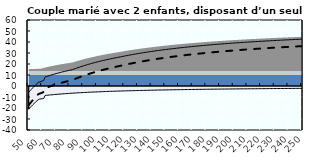
| Category | Coin fiscal moyen (somme des composantes) | Taux moyen d'imposition net en % du salaire brut |
|---|---|---|
| 50.0 | -5.731 | -17.415 |
| 51.0 | -4.304 | -15.83 |
| 52.0 | -2.932 | -14.306 |
| 53.0 | -1.612 | -12.84 |
| 54.0 | -0.341 | -11.428 |
| 55.0 | 0.884 | -10.068 |
| 56.0 | 2.066 | -8.756 |
| 57.0 | 3.206 | -7.49 |
| 58.0 | 3.729 | -6.909 |
| 59.0 | 4.074 | -6.525 |
| 60.0 | 4.6 | -5.942 |
| 61.0 | 5.108 | -5.377 |
| 62.0 | 8.122 | -2.03 |
| 63.0 | 8.559 | -1.546 |
| 64.0 | 8.981 | -1.076 |
| 65.0 | 9.391 | -0.621 |
| 66.0 | 9.788 | -0.18 |
| 67.0 | 10.174 | 0.248 |
| 68.0 | 10.548 | 0.664 |
| 69.0 | 10.911 | 1.067 |
| 70.0 | 11.264 | 1.459 |
| 71.0 | 11.607 | 1.84 |
| 72.0 | 11.941 | 2.21 |
| 73.0 | 12.265 | 2.57 |
| 74.0 | 12.58 | 2.921 |
| 75.0 | 12.888 | 3.262 |
| 76.0 | 13.187 | 3.594 |
| 77.0 | 13.478 | 3.917 |
| 78.0 | 13.762 | 4.232 |
| 79.0 | 14.038 | 4.54 |
| 80.0 | 14.308 | 4.839 |
| 81.0 | 14.571 | 5.131 |
| 82.0 | 14.871 | 5.464 |
| 83.0 | 15.338 | 5.982 |
| 84.0 | 15.793 | 6.489 |
| 85.0 | 16.239 | 6.983 |
| 86.0 | 16.673 | 7.466 |
| 87.0 | 17.098 | 7.937 |
| 88.0 | 17.513 | 8.398 |
| 89.0 | 17.919 | 8.849 |
| 90.0 | 18.316 | 9.289 |
| 91.0 | 18.704 | 9.72 |
| 92.0 | 19.083 | 10.142 |
| 93.0 | 19.455 | 10.554 |
| 94.0 | 19.818 | 10.958 |
| 95.0 | 20.174 | 11.353 |
| 96.0 | 20.522 | 11.74 |
| 97.0 | 20.864 | 12.119 |
| 98.0 | 21.198 | 12.49 |
| 99.0 | 21.525 | 12.854 |
| 100.0 | 21.846 | 13.21 |
| 101.0 | 22.161 | 13.56 |
| 102.0 | 22.47 | 13.902 |
| 103.0 | 22.772 | 14.238 |
| 104.0 | 23.069 | 14.568 |
| 105.0 | 23.36 | 14.891 |
| 106.0 | 23.645 | 15.208 |
| 107.0 | 23.925 | 15.519 |
| 108.0 | 24.2 | 15.824 |
| 109.0 | 24.47 | 16.124 |
| 110.0 | 24.735 | 16.419 |
| 111.0 | 24.996 | 16.708 |
| 112.0 | 25.251 | 16.991 |
| 113.0 | 25.502 | 17.27 |
| 114.0 | 25.749 | 17.544 |
| 115.0 | 25.991 | 17.813 |
| 116.0 | 26.23 | 18.078 |
| 117.0 | 26.465 | 18.34 |
| 118.0 | 26.722 | 18.625 |
| 119.0 | 26.975 | 18.906 |
| 120.0 | 27.223 | 19.181 |
| 121.0 | 27.467 | 19.453 |
| 122.0 | 27.708 | 19.719 |
| 123.0 | 27.944 | 19.982 |
| 124.0 | 28.177 | 20.24 |
| 125.0 | 28.405 | 20.494 |
| 126.0 | 28.631 | 20.744 |
| 127.0 | 28.852 | 20.99 |
| 128.0 | 29.07 | 21.233 |
| 129.0 | 29.285 | 21.471 |
| 130.0 | 29.497 | 21.706 |
| 131.0 | 29.705 | 21.937 |
| 132.0 | 29.91 | 22.165 |
| 133.0 | 30.112 | 22.389 |
| 134.0 | 30.311 | 22.61 |
| 135.0 | 30.507 | 22.828 |
| 136.0 | 30.7 | 23.042 |
| 137.0 | 30.89 | 23.254 |
| 138.0 | 31.078 | 23.462 |
| 139.0 | 31.263 | 23.667 |
| 140.0 | 31.445 | 23.87 |
| 141.0 | 31.625 | 24.069 |
| 142.0 | 31.802 | 24.266 |
| 143.0 | 31.977 | 24.46 |
| 144.0 | 32.149 | 24.651 |
| 145.0 | 32.319 | 24.84 |
| 146.0 | 32.486 | 25.026 |
| 147.0 | 32.651 | 25.209 |
| 148.0 | 32.814 | 25.39 |
| 149.0 | 32.975 | 25.569 |
| 150.0 | 33.134 | 25.745 |
| 151.0 | 33.29 | 25.919 |
| 152.0 | 33.445 | 26.091 |
| 153.0 | 33.597 | 26.26 |
| 154.0 | 33.748 | 26.427 |
| 155.0 | 33.896 | 26.592 |
| 156.0 | 34.043 | 26.755 |
| 157.0 | 34.188 | 26.916 |
| 158.0 | 34.331 | 27.074 |
| 159.0 | 34.472 | 27.231 |
| 160.0 | 34.611 | 27.386 |
| 161.0 | 34.749 | 27.539 |
| 162.0 | 34.885 | 27.69 |
| 163.0 | 35.019 | 27.839 |
| 164.0 | 35.152 | 27.986 |
| 165.0 | 35.283 | 28.132 |
| 166.0 | 35.413 | 28.276 |
| 167.0 | 35.541 | 28.418 |
| 168.0 | 35.667 | 28.558 |
| 169.0 | 35.792 | 28.697 |
| 170.0 | 35.915 | 28.834 |
| 171.0 | 36.037 | 28.969 |
| 172.0 | 36.158 | 29.103 |
| 173.0 | 36.277 | 29.236 |
| 174.0 | 36.395 | 29.366 |
| 175.0 | 36.511 | 29.496 |
| 176.0 | 36.626 | 29.624 |
| 177.0 | 36.74 | 29.75 |
| 178.0 | 36.853 | 29.875 |
| 179.0 | 36.964 | 29.999 |
| 180.0 | 37.074 | 30.121 |
| 181.0 | 37.183 | 30.242 |
| 182.0 | 37.291 | 30.361 |
| 183.0 | 37.397 | 30.48 |
| 184.0 | 37.503 | 30.597 |
| 185.0 | 37.607 | 30.712 |
| 186.0 | 37.71 | 30.827 |
| 187.0 | 37.812 | 30.94 |
| 188.0 | 37.913 | 31.052 |
| 189.0 | 38.012 | 31.163 |
| 190.0 | 38.111 | 31.272 |
| 191.0 | 38.209 | 31.381 |
| 192.0 | 38.306 | 31.488 |
| 193.0 | 38.401 | 31.595 |
| 194.0 | 38.496 | 31.7 |
| 195.0 | 38.59 | 31.804 |
| 196.0 | 38.683 | 31.907 |
| 197.0 | 38.774 | 32.009 |
| 198.0 | 38.865 | 32.11 |
| 199.0 | 38.955 | 32.21 |
| 200.0 | 39.044 | 32.309 |
| 201.0 | 39.133 | 32.407 |
| 202.0 | 39.22 | 32.504 |
| 203.0 | 39.306 | 32.6 |
| 204.0 | 39.392 | 32.695 |
| 205.0 | 39.477 | 32.789 |
| 206.0 | 39.561 | 32.882 |
| 207.0 | 39.644 | 32.975 |
| 208.0 | 39.726 | 33.066 |
| 209.0 | 39.808 | 33.157 |
| 210.0 | 39.889 | 33.247 |
| 211.0 | 39.969 | 33.335 |
| 212.0 | 40.048 | 33.423 |
| 213.0 | 40.127 | 33.511 |
| 214.0 | 40.204 | 33.597 |
| 215.0 | 40.282 | 33.683 |
| 216.0 | 40.358 | 33.767 |
| 217.0 | 40.434 | 33.851 |
| 218.0 | 40.509 | 33.935 |
| 219.0 | 40.583 | 34.017 |
| 220.0 | 40.656 | 34.099 |
| 221.0 | 40.729 | 34.18 |
| 222.0 | 40.802 | 34.26 |
| 223.0 | 40.873 | 34.34 |
| 224.0 | 40.944 | 34.419 |
| 225.0 | 41.015 | 34.497 |
| 226.0 | 41.084 | 34.574 |
| 227.0 | 41.153 | 34.651 |
| 228.0 | 41.222 | 34.727 |
| 229.0 | 41.29 | 34.802 |
| 230.0 | 41.357 | 34.877 |
| 231.0 | 41.424 | 34.951 |
| 232.0 | 41.49 | 35.025 |
| 233.0 | 41.556 | 35.098 |
| 234.0 | 41.621 | 35.17 |
| 235.0 | 41.685 | 35.242 |
| 236.0 | 41.749 | 35.313 |
| 237.0 | 41.813 | 35.383 |
| 238.0 | 41.876 | 35.453 |
| 239.0 | 41.938 | 35.522 |
| 240.0 | 42 | 35.591 |
| 241.0 | 42.061 | 35.659 |
| 242.0 | 42.122 | 35.726 |
| 243.0 | 42.182 | 35.793 |
| 244.0 | 42.242 | 35.86 |
| 245.0 | 42.301 | 35.926 |
| 246.0 | 42.36 | 35.991 |
| 247.0 | 42.418 | 36.056 |
| 248.0 | 42.476 | 36.12 |
| 249.0 | 42.534 | 36.184 |
| 250.0 | 42.591 | 36.247 |